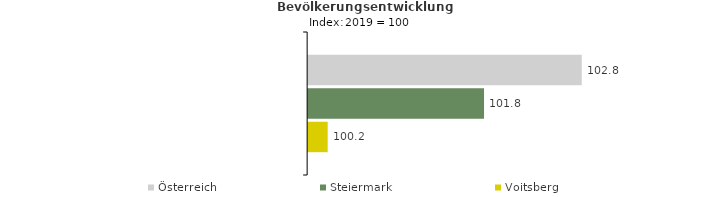
| Category | Österreich | Steiermark | Voitsberg |
|---|---|---|---|
| 2023.0 | 102.8 | 101.8 | 100.2 |